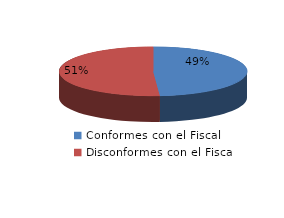
| Category | Series 0 |
|---|---|
| 0 | 236 |
| 1 | 247 |